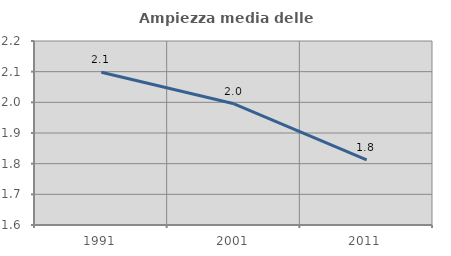
| Category | Ampiezza media delle famiglie |
|---|---|
| 1991.0 | 2.098 |
| 2001.0 | 1.995 |
| 2011.0 | 1.812 |